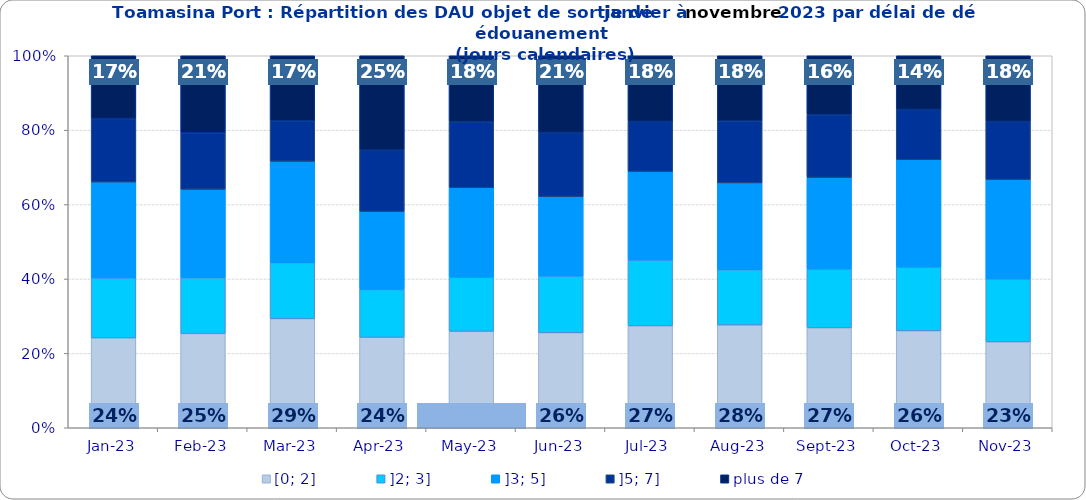
| Category | [0; 2] | ]2; 3] | ]3; 5] | ]5; 7] | plus de 7 |
|---|---|---|---|---|---|
| 2023-01-01 | 0.242 | 0.161 | 0.258 | 0.171 | 0.169 |
| 2023-02-01 | 0.253 | 0.15 | 0.238 | 0.152 | 0.207 |
| 2023-03-01 | 0.293 | 0.151 | 0.272 | 0.109 | 0.175 |
| 2023-04-01 | 0.243 | 0.129 | 0.209 | 0.165 | 0.254 |
| 2023-05-01 | 0.259 | 0.146 | 0.24 | 0.178 | 0.177 |
| 2023-06-01 | 0.255 | 0.152 | 0.213 | 0.173 | 0.206 |
| 2023-07-01 | 0.274 | 0.177 | 0.238 | 0.135 | 0.177 |
| 2023-08-01 | 0.276 | 0.148 | 0.233 | 0.166 | 0.175 |
| 2023-09-01 | 0.269 | 0.158 | 0.246 | 0.169 | 0.158 |
| 2023-10-01 | 0.261 | 0.171 | 0.289 | 0.135 | 0.144 |
| 2023-11-01 | 0.231 | 0.169 | 0.267 | 0.156 | 0.177 |